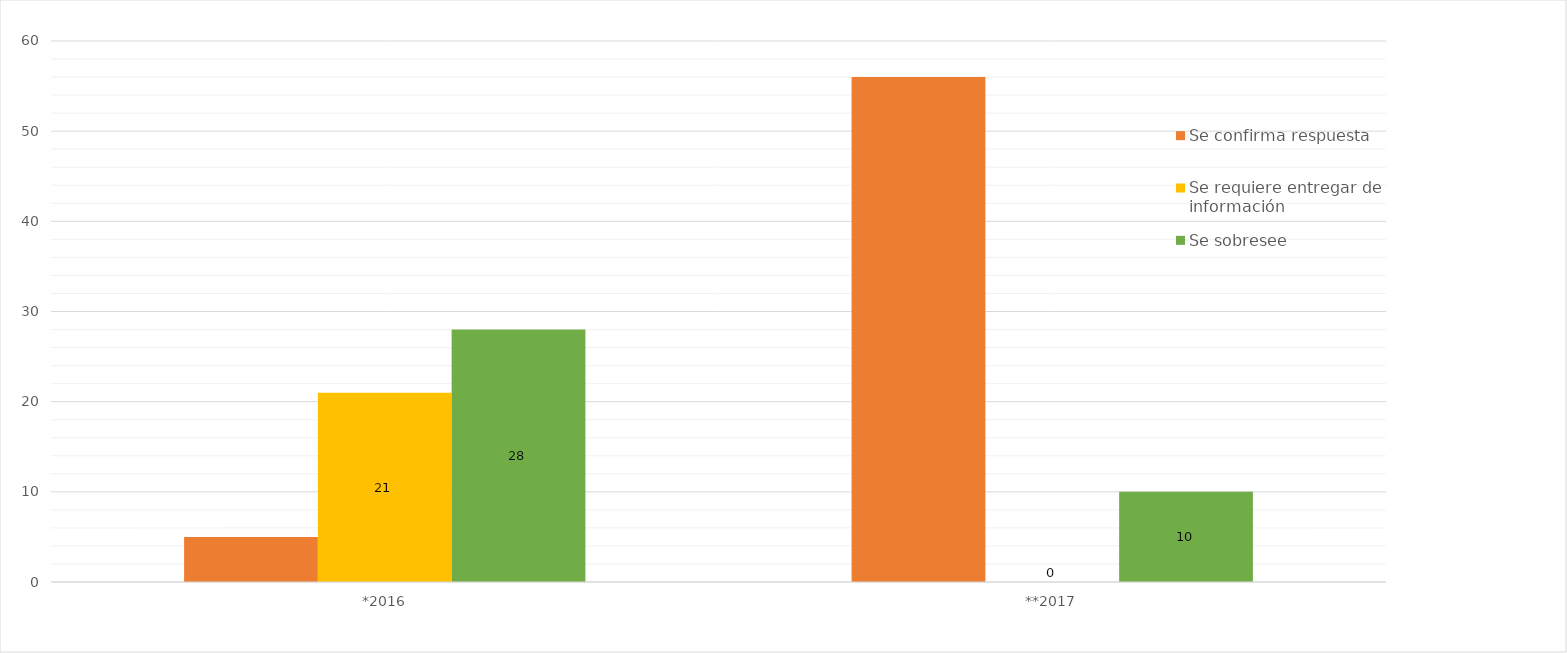
| Category | Se confirma respuesta | Se requiere entregar de información  | Se sobresee  |
|---|---|---|---|
| *2016 | 5 | 21 | 28 |
| **2017 | 56 | 0 | 10 |